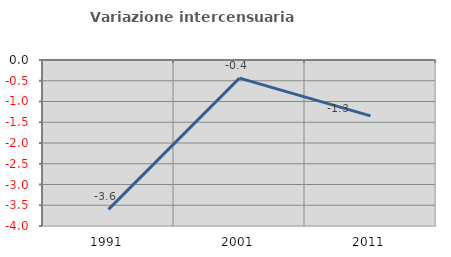
| Category | Variazione intercensuaria annua |
|---|---|
| 1991.0 | -3.6 |
| 2001.0 | -0.437 |
| 2011.0 | -1.347 |